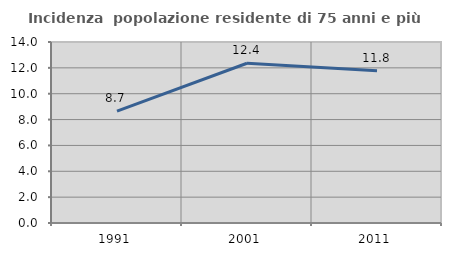
| Category | Incidenza  popolazione residente di 75 anni e più |
|---|---|
| 1991.0 | 8.655 |
| 2001.0 | 12.359 |
| 2011.0 | 11.775 |